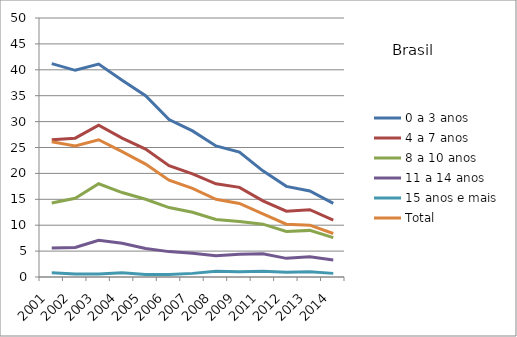
| Category | 0 a 3 anos | 4 a 7 anos | 8 a 10 anos | 11 a 14 anos | 15 anos e mais | Total |
|---|---|---|---|---|---|---|
| 2001.0 | 41.2 | 26.5 | 14.3 | 5.6 | 0.8 | 26.1 |
| 2002.0 | 39.9 | 26.8 | 15.2 | 5.7 | 0.6 | 25.3 |
| 2003.0 | 41.1 | 29.3 | 18 | 7.1 | 0.6 | 26.5 |
| 2004.0 | 38 | 26.8 | 16.3 | 6.5 | 0.8 | 24.2 |
| 2005.0 | 35 | 24.7 | 15 | 5.5 | 0.5 | 21.8 |
| 2006.0 | 30.4 | 21.5 | 13.4 | 4.9 | 0.5 | 18.7 |
| 2007.0 | 28.2 | 19.9 | 12.5 | 4.6 | 0.7 | 17.1 |
| 2008.0 | 25.3 | 18 | 11.1 | 4.1 | 1.1 | 15 |
| 2009.0 | 24.1 | 17.3 | 10.7 | 4.4 | 1 | 14.2 |
| 2011.0 | 20.5 | 14.7 | 10.2 | 4.5 | 1.1 | 12.2 |
| 2012.0 | 17.5 | 12.7 | 8.8 | 3.6 | 0.9 | 10.2 |
| 2013.0 | 16.6 | 13 | 9 | 3.9 | 1 | 10 |
| 2014.0 | 14.2 | 11 | 7.6 | 3.3 | 0.7 | 8.4 |